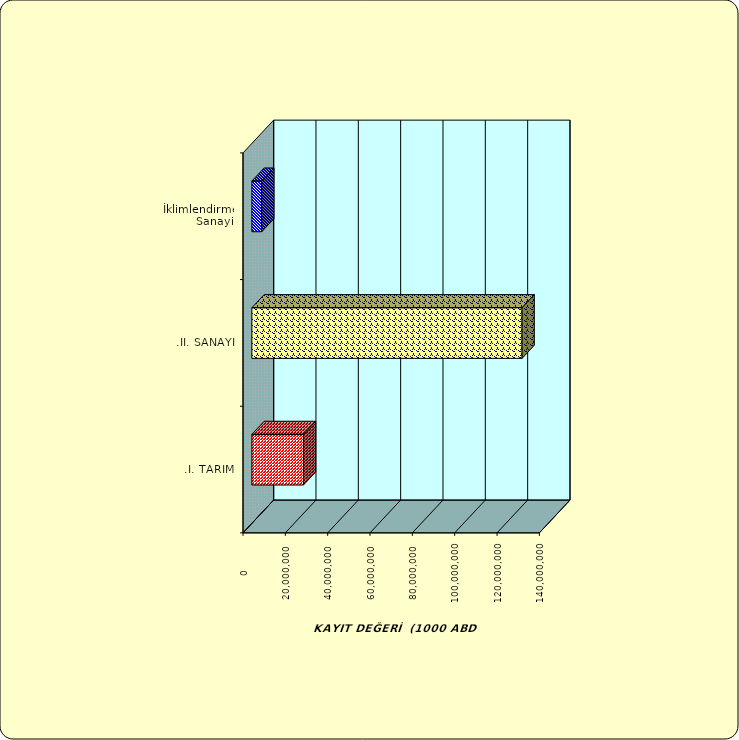
| Category | Series 0 |
|---|---|
| .I. TARIM | 24369142.859 |
| .II. SANAYİ | 127645229.591 |
|  İklimlendirme Sanayii | 4664483.41 |